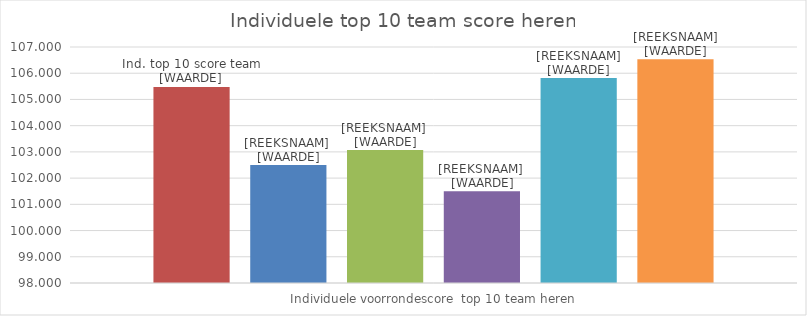
| Category | WK ind. Top 10 team score | Joep | Jordy | Luuk | Milco | Roel |
|---|---|---|---|---|---|---|
| Individuele voorrondescore  top 10 team heren | 105.472 | 102.5 | 103.07 | 101.5 | 105.815 | 106.535 |